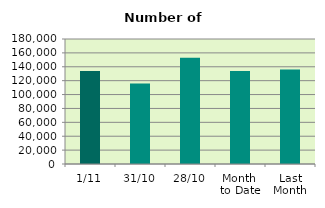
| Category | Series 0 |
|---|---|
| 1/11 | 133792 |
| 31/10 | 115954 |
| 28/10 | 152862 |
| Month 
to Date | 133792 |
| Last
Month | 136171.238 |